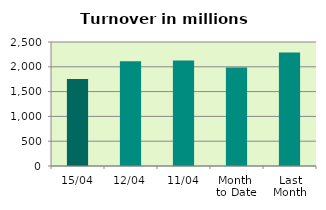
| Category | Series 0 |
|---|---|
| 15/04 | 1751.988 |
| 12/04 | 2113.023 |
| 11/04 | 2126.978 |
| Month 
to Date | 1986.655 |
| Last
Month | 2286.259 |